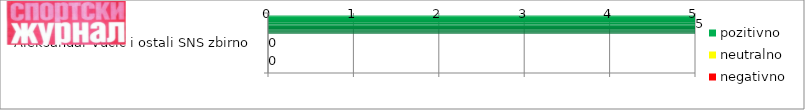
| Category | pozitivno | neutralno | negativno |
|---|---|---|---|
| Aleksandar Vučić i ostali SNS zbirno | 5 | 0 | 0 |